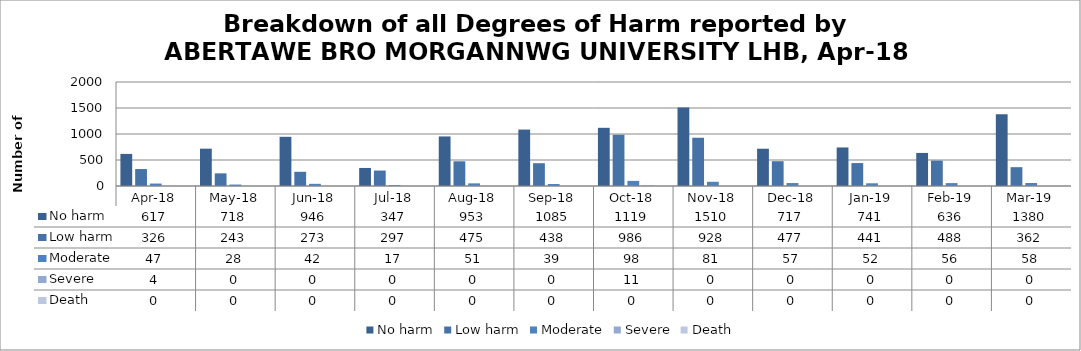
| Category | No harm | Low harm | Moderate | Severe | Death |
|---|---|---|---|---|---|
| Apr-18 | 617 | 326 | 47 | 4 | 0 |
| May-18 | 718 | 243 | 28 | 0 | 0 |
| Jun-18 | 946 | 273 | 42 | 0 | 0 |
| Jul-18 | 347 | 297 | 17 | 0 | 0 |
| Aug-18 | 953 | 475 | 51 | 0 | 0 |
| Sep-18 | 1085 | 438 | 39 | 0 | 0 |
| Oct-18 | 1119 | 986 | 98 | 11 | 0 |
| Nov-18 | 1510 | 928 | 81 | 0 | 0 |
| Dec-18 | 717 | 477 | 57 | 0 | 0 |
| Jan-19 | 741 | 441 | 52 | 0 | 0 |
| Feb-19 | 636 | 488 | 56 | 0 | 0 |
| Mar-19 | 1380 | 362 | 58 | 0 | 0 |